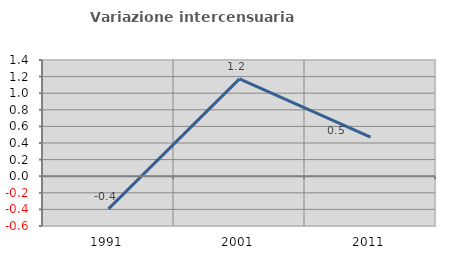
| Category | Variazione intercensuaria annua |
|---|---|
| 1991.0 | -0.393 |
| 2001.0 | 1.173 |
| 2011.0 | 0.47 |